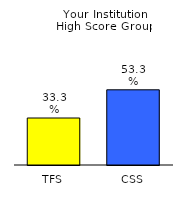
| Category | Series 0 |
|---|---|
| TFS | 0.333 |
| CSS | 0.533 |